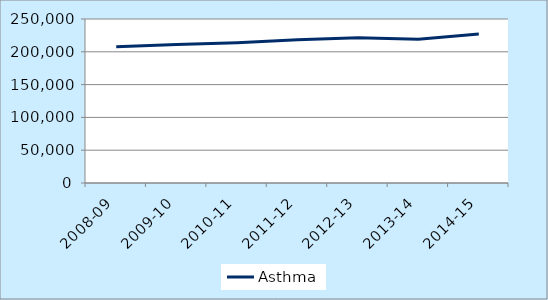
| Category | Asthma |
|---|---|
| 2008-09 | 207513 |
| 2009-10 | 210952 |
| 2010-11 | 213752 |
| 2011-12 | 218243 |
| 2012-13 | 221356 |
| 2013-14 | 219238 |
| 2014-15 | 227075 |